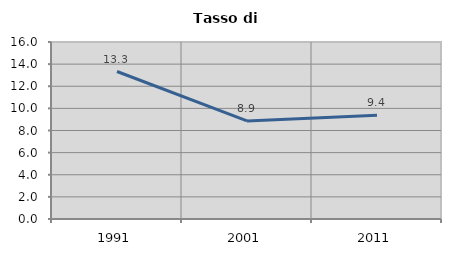
| Category | Tasso di disoccupazione   |
|---|---|
| 1991.0 | 13.333 |
| 2001.0 | 8.867 |
| 2011.0 | 9.375 |